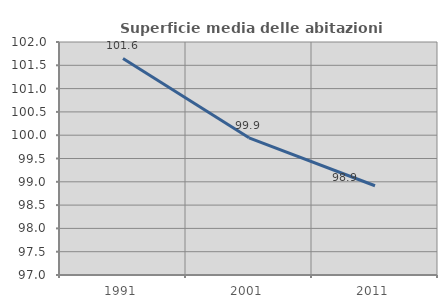
| Category | Superficie media delle abitazioni occupate |
|---|---|
| 1991.0 | 101.647 |
| 2001.0 | 99.945 |
| 2011.0 | 98.915 |